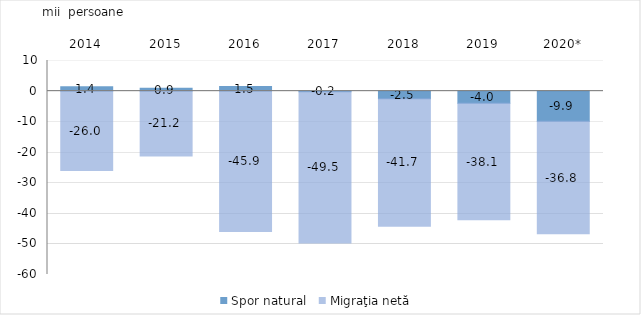
| Category | Spor natural | Migraţia netă  |
|---|---|---|
| 2014 | 1.4 | -26 |
| 2015 | 0.9 | -21.2 |
| 2016 | 1.5 | -45.9 |
| 2017 | -0.2 | -49.5 |
| 2018 | -2.5 | -41.7 |
| 2019 | -4 | -38.1 |
| 2020* | -9.9 | -36.8 |